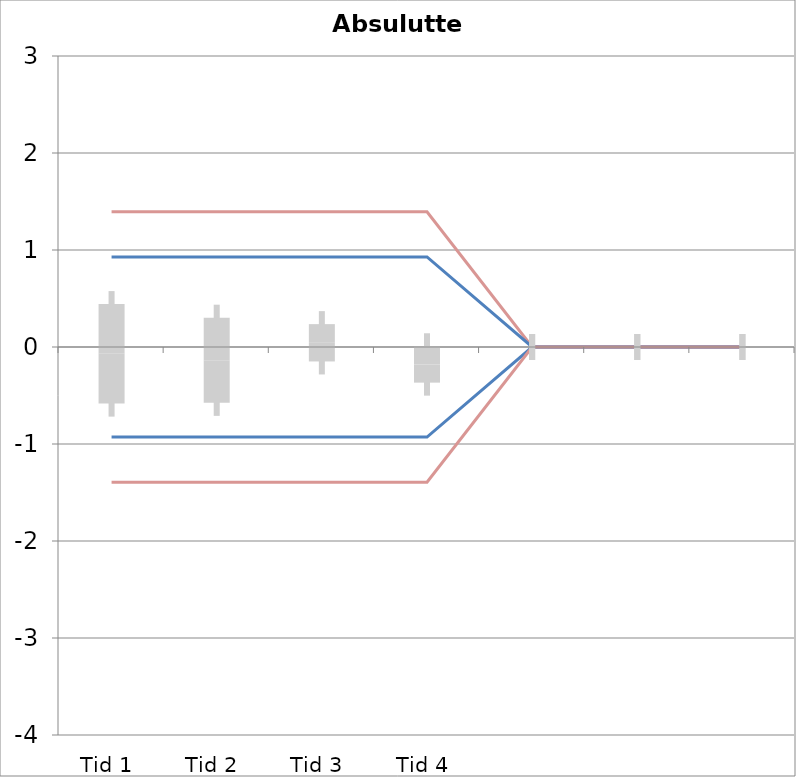
| Category | 1 | 2 | 3 | 4 | 5 | 6 | 7 | 8 | 9 | 10 | 11 | 12 | 13 | 14 | 15 | 16 | 17 | 18 | 19 | 20 | TEa | B | -B | -TEa | M |
|---|---|---|---|---|---|---|---|---|---|---|---|---|---|---|---|---|---|---|---|---|---|---|---|---|---|
| Tid 1 | -0.06 | 0 | -0.35 | -0.08 | -3 | -0.06 | 0 | -0.05 | -0.02 | 1.01 | -0.42 | -0.05 | 0.01 | 0.02 | 0.01 | 1.91 | 0 | 0 | 0 | 0 | 1.393 | 0.929 | -0.929 | -1.393 | -0.071 |
| Tid 2 | -0.52 | 0 | -0.21 | 0.15 | -2.58 | -0.06 | 0.03 | -0.09 | 0.14 | 1.78 | -0.32 | -0.09 | -0.02 | 0 | 0.02 | -0.42 | 0 | 0 | 0 | 0 | 1.393 | 0.929 | -0.929 | -1.393 | -0.137 |
| Tid 3 | -0.21 | 0 | -0.14 | 0.24 | 0 | -0.07 | -0.04 | -0.09 | -0.08 | 0.73 | -0.47 | -0.09 | 0 | 0.02 | -0.05 | 0.9 | 0 | 0 | 0 | 0 | 1.393 | 0.929 | -0.929 | -1.393 | 0.043 |
| Tid 4 | -0.5 | 0 | -0.08 | -0.12 | 0 | -0.1 | 0 | -0.12 | -0.07 | 0 | -1.22 | -0.1 | -0.02 | 0 | -0.04 | -0.15 | 0 | 0 | 0 | 0 | 1.393 | 0.929 | -0.929 | -1.393 | -0.18 |